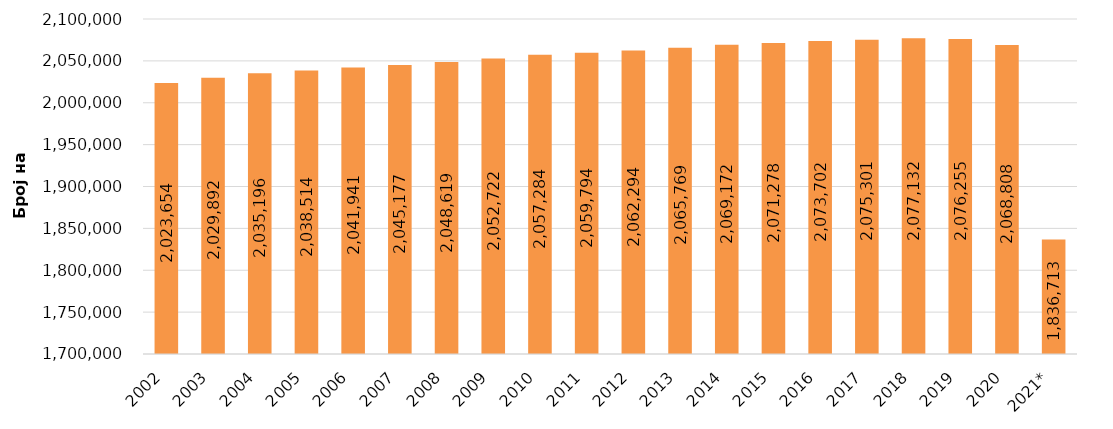
| Category | Вкупно |
|---|---|
| 2002 | 2023654 |
| 2003 | 2029892 |
| 2004 | 2035196 |
| 2005 | 2038514 |
| 2006 | 2041941 |
| 2007 | 2045177 |
| 2008 | 2048619 |
| 2009 | 2052722 |
| 2010 | 2057284 |
| 2011 | 2059794 |
| 2012 | 2062294 |
| 2013 | 2065769 |
| 2014 | 2069172 |
| 2015 | 2071278 |
| 2016 | 2073702 |
| 2017 | 2075301 |
| 2018 | 2077132 |
| 2019 | 2076255 |
| 2020 | 2068808 |
| 2021* | 1836713 |